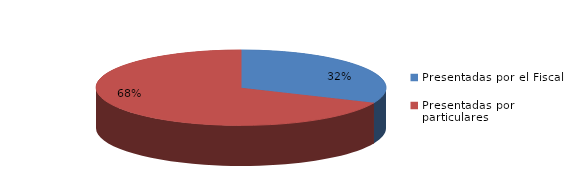
| Category | Series 0 |
|---|---|
| Presentadas por el Fiscal | 144 |
| Presentadas por particulares | 312 |